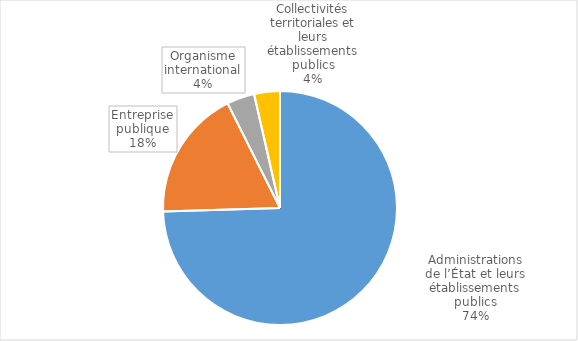
| Category | Series 0 |
|---|---|
| Administrations de l’État et leurs établissements publics | 272 |
| Entreprise publique | 66 |
| Organisme international | 14 |
| Collectivités territoriales et leurs établissements publics | 13 |